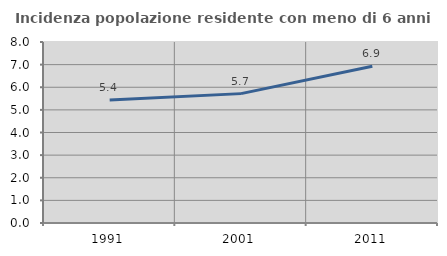
| Category | Incidenza popolazione residente con meno di 6 anni |
|---|---|
| 1991.0 | 5.439 |
| 2001.0 | 5.718 |
| 2011.0 | 6.929 |